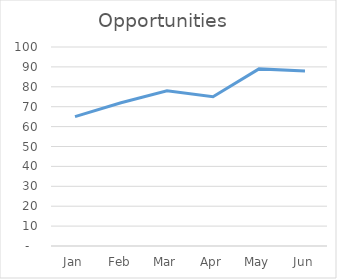
| Category | Opportunities |
|---|---|
| Jan | 65 |
| Feb | 72 |
| Mar | 78 |
| Apr | 75 |
| May | 89 |
| Jun | 88 |